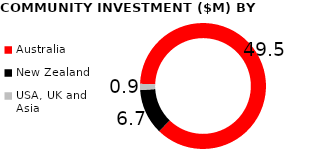
| Category | Series 0 |
|---|---|
| Australia | 49.5 |
| New Zealand | 6.7 |
| USA, UK and Asia | 0.9 |